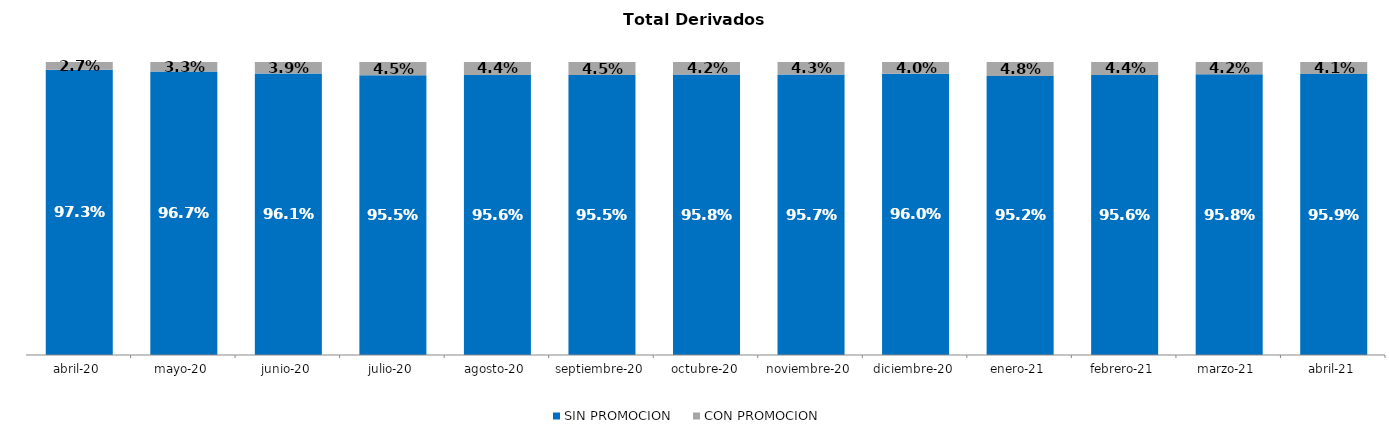
| Category | SIN PROMOCION   | CON PROMOCION   |
|---|---|---|
| 2020-04-01 | 0.973 | 0.027 |
| 2020-05-01 | 0.967 | 0.033 |
| 2020-06-01 | 0.961 | 0.039 |
| 2020-07-01 | 0.955 | 0.045 |
| 2020-08-01 | 0.956 | 0.044 |
| 2020-09-01 | 0.955 | 0.045 |
| 2020-10-01 | 0.958 | 0.042 |
| 2020-11-01 | 0.957 | 0.043 |
| 2020-12-01 | 0.96 | 0.04 |
| 2021-01-01 | 0.952 | 0.048 |
| 2021-02-01 | 0.956 | 0.044 |
| 2021-03-01 | 0.958 | 0.042 |
| 2021-04-01 | 0.959 | 0.041 |